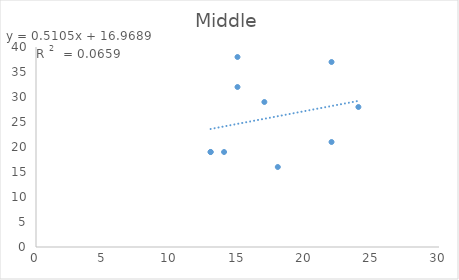
| Category | Middle |
|---|---|
| 14.0 | 19 |
| 17.0 | 29 |
| 18.0 | 16 |
| 13.0 | 19 |
| 13.0 | 19 |
| 24.0 | 28 |
| 15.0 | 38 |
| 15.0 | 32 |
| 22.0 | 37 |
| 22.0 | 21 |